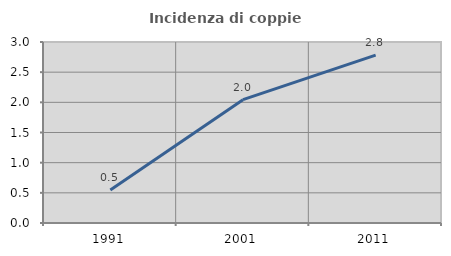
| Category | Incidenza di coppie miste |
|---|---|
| 1991.0 | 0.548 |
| 2001.0 | 2.044 |
| 2011.0 | 2.783 |